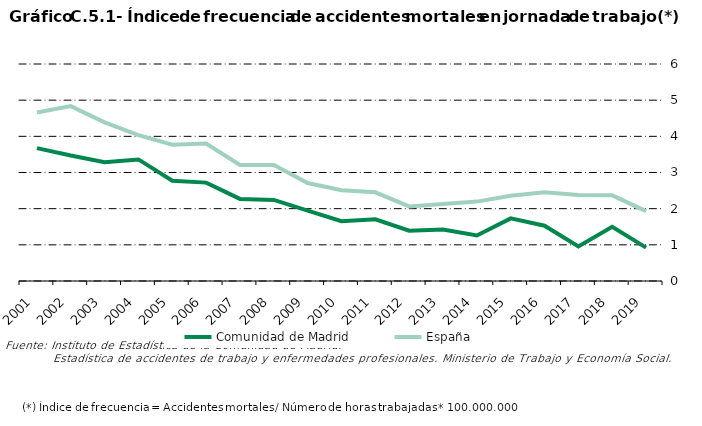
| Category | Comunidad de Madrid | España |
|---|---|---|
| 2001.0 | 3.674 | 4.66 |
| 2002.0 | 3.469 | 4.836 |
| 2003.0 | 3.285 | 4.387 |
| 2004.0 | 3.362 | 4.033 |
| 2005.0 | 2.771 | 3.769 |
| 2006.0 | 2.72 | 3.8 |
| 2007.0 | 2.27 | 3.21 |
| 2008.0 | 2.242 | 3.209 |
| 2009.0 | 1.947 | 2.709 |
| 2010.0 | 1.652 | 2.509 |
| 2011.0 | 1.707 | 2.452 |
| 2012.0 | 1.39 | 2.063 |
| 2013.0 | 1.425 | 2.129 |
| 2014.0 | 1.259 | 2.195 |
| 2015.0 | 1.731 | 2.358 |
| 2016.0 | 1.529 | 2.455 |
| 2017.0 | 0.958 | 2.376 |
| 2018.0 | 1.501 | 2.368 |
| 2019.0 | 0.923 | 1.932 |